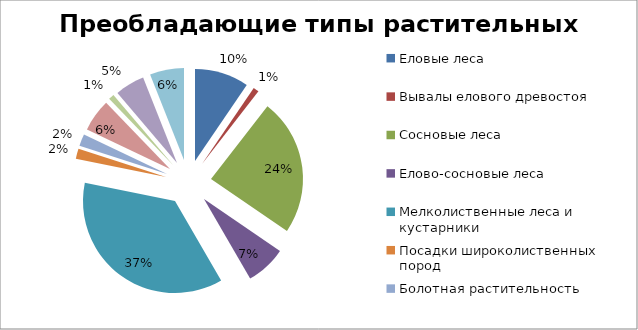
| Category | Series 0 |
|---|---|
| Еловые леса | 9.5 |
| Вывалы елового древостоя | 1 |
| Сосновые леса | 24 |
| Елово-сосновые леса | 7.1 |
| Мелколиственные леса и кустарники | 36.5 |
| Посадки широколиственных пород | 1.8 |
| Болотная растительность | 2.1 |
| Луговая растительность | 5.7 |
| Псаммофитная и прибрежноводная растительность | 1 |
| Базы отдыха с участками леса | 5.2 |
| Поселки | 6 |